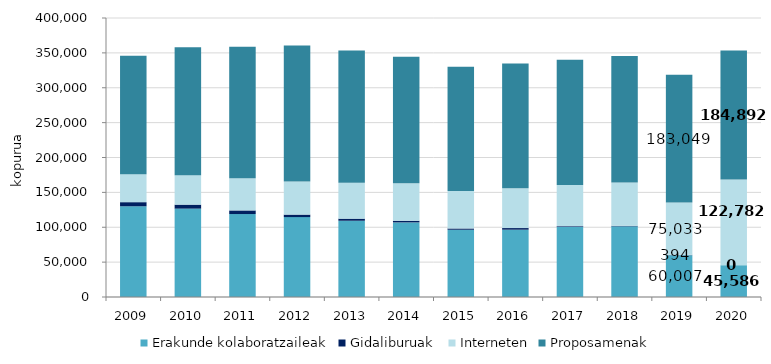
| Category | Erakunde kolaboratzaileak | Gidaliburuak  | Interneten | Proposamenak |
|---|---|---|---|---|
| 2009.0 | 130077 | 5880 | 40173 | 169670 |
| 2010.0 | 126722 | 5687 | 42319 | 183242 |
| 2011.0 | 118944 | 5162 | 46264 | 188235 |
| 2012.0 | 114561 | 3580 | 47321 | 195282 |
| 2013.0 | 109332 | 3012 | 51592 | 189526 |
| 2014.0 | 106945 | 2347 | 53742 | 181366 |
| 2015.0 | 96432 | 1819 | 53598 | 178257 |
| 2016.0 | 96513 | 2276 | 57092 | 179060 |
| 2017.0 | 100458 | 1082 | 59112 | 179414 |
| 2018.0 | 101358 | 657 | 62077 | 181504 |
| 2019.0 | 60007 | 394 | 75033 | 183049 |
| 2020.0 | 45586 | 0 | 122782 | 184892 |